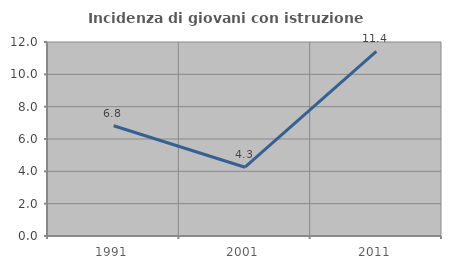
| Category | Incidenza di giovani con istruzione universitaria |
|---|---|
| 1991.0 | 6.818 |
| 2001.0 | 4.255 |
| 2011.0 | 11.416 |